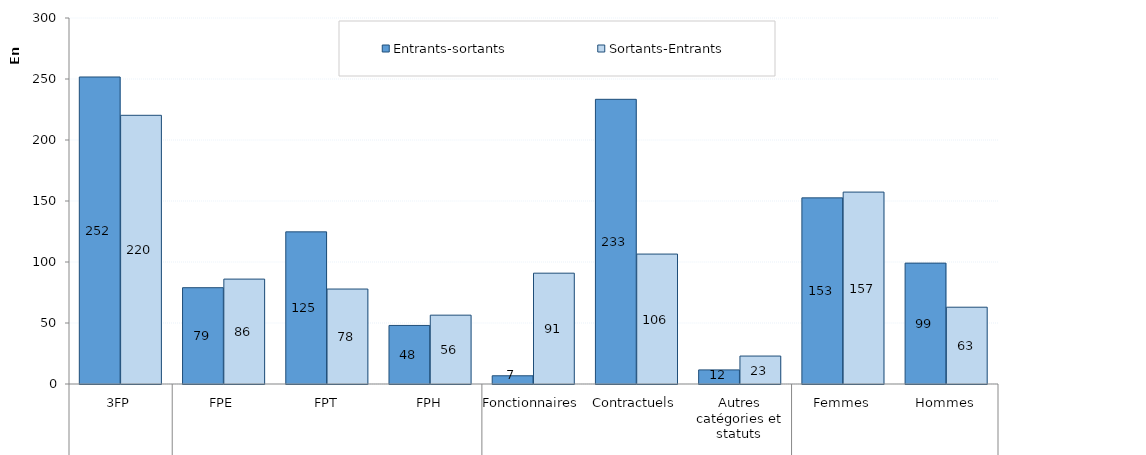
| Category | Entrants-sortants | Sortants-Entrants |
|---|---|---|
| 0 | 251648 | 220237 |
| 1 | 78941 | 85987 |
| 2 | 124709 | 77833 |
| 3 | 47998 | 56417 |
| 4 | 6739 | 90836 |
| 5 | 233345 | 106494 |
| 6 | 11564 | 22907 |
| 7 | 152567 | 157301 |
| 8 | 99081 | 62936 |